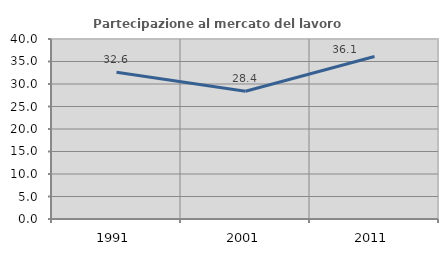
| Category | Partecipazione al mercato del lavoro  femminile |
|---|---|
| 1991.0 | 32.597 |
| 2001.0 | 28.384 |
| 2011.0 | 36.109 |